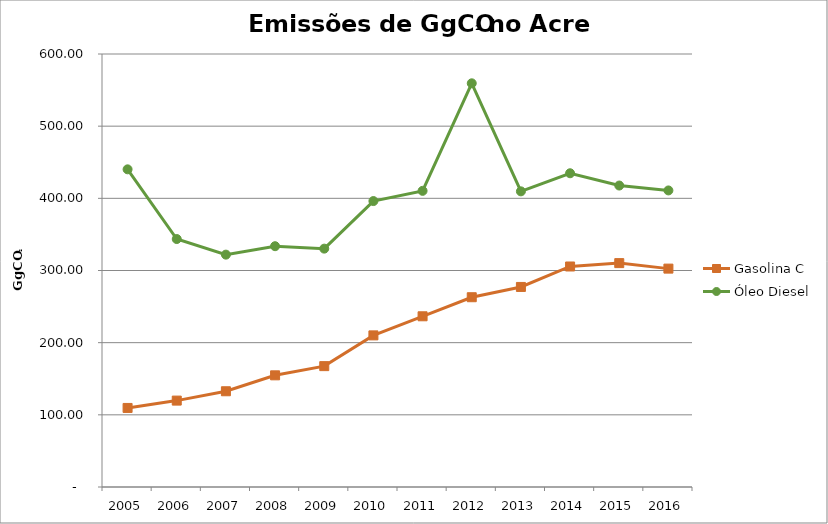
| Category | Gasolina C | Óleo Diesel |
|---|---|---|
| 2005.0 | 109.553 | 440.193 |
| 2006.0 | 119.713 | 343.597 |
| 2007.0 | 132.677 | 321.97 |
| 2008.0 | 154.74 | 333.676 |
| 2009.0 | 167.485 | 330.294 |
| 2010.0 | 210.083 | 396.231 |
| 2011.0 | 236.547 | 410.372 |
| 2012.0 | 262.962 | 559.398 |
| 2013.0 | 277.202 | 409.676 |
| 2014.0 | 305.561 | 434.737 |
| 2015.0 | 310.221 | 417.738 |
| 2016.0 | 302.61 | 410.948 |